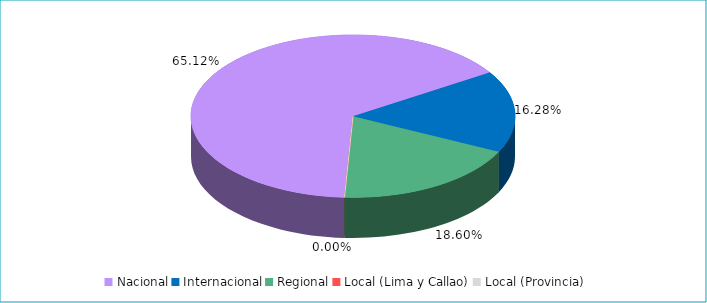
| Category | Series 0 |
|---|---|
| Nacional | 0.651 |
| Internacional | 0.163 |
| Regional | 0.186 |
| Local (Lima y Callao) | 0 |
| Local (Provincia) | 0 |